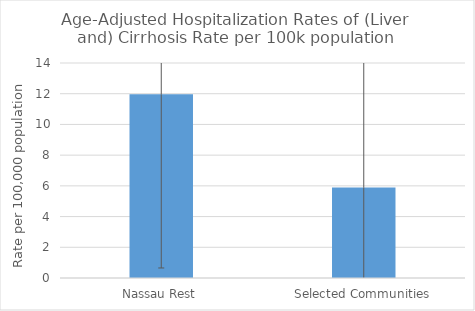
| Category | Age-Adjusted Hospitalization Rates of (Liver and) Cirrhosis Rate per 100k population |
|---|---|
| Nassau Rest | 11.962 |
| Selected Communities | 5.9 |